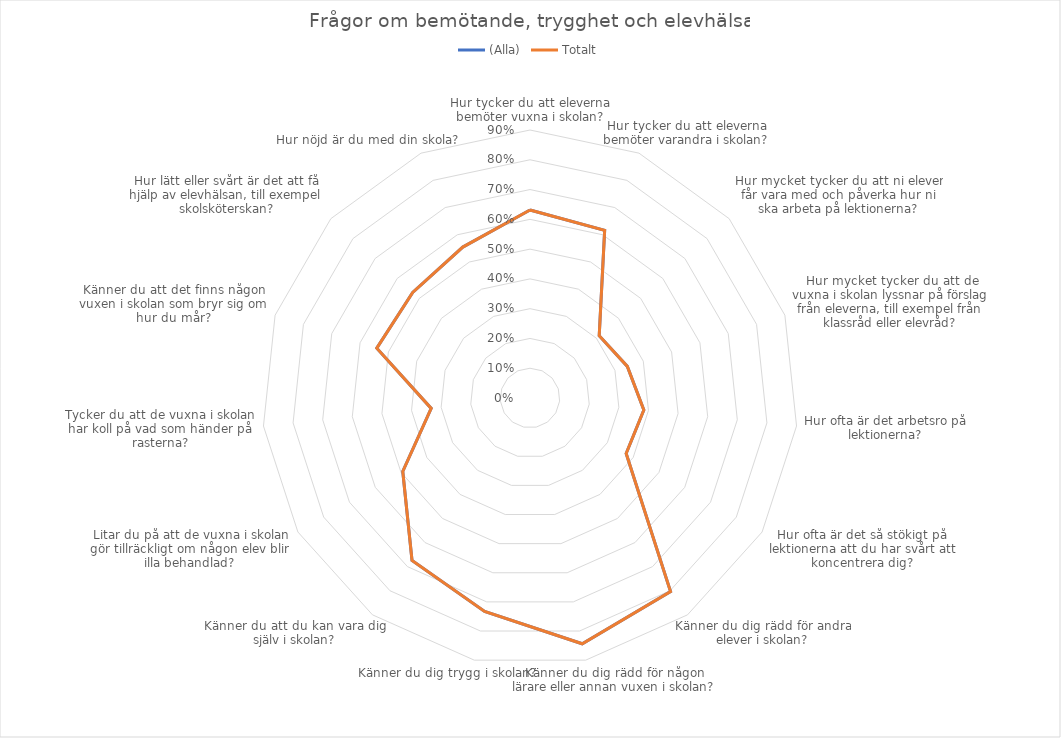
| Category | (Alla) | Totalt |
|---|---|---|
| Hur tycker du att eleverna bemöter vuxna i skolan? | 0.631 | 0.631 |
| Hur tycker du att eleverna bemöter varandra i skolan? | 0.616 | 0.616 |
| Hur mycket tycker du att ni elever får vara med och påverka hur ni ska arbeta på lektionerna? | 0.313 | 0.313 |
| Hur mycket tycker du att de vuxna i skolan lyssnar på förslag från eleverna, till exempel från klassråd eller elevråd? | 0.344 | 0.344 |
| Hur ofta är det arbetsro på lektionerna? | 0.384 | 0.384 |
| Hur ofta är det så stökigt på lektionerna att du har svårt att koncentrera dig? | 0.373 | 0.373 |
| Känner du dig rädd för andra elever i skolan? | 0.803 | 0.803 |
| Känner du dig rädd för någon lärare eller annan vuxen i skolan? | 0.844 | 0.844 |
| Känner du dig trygg i skolan? | 0.733 | 0.733 |
| Känner du att du kan vara dig själv i skolan? | 0.674 | 0.674 |
| Litar du på att de vuxna i skolan gör tillräckligt om någon elev blir illa behandlad? | 0.493 | 0.493 |
| Tycker du att de vuxna i skolan har koll på vad som händer på rasterna? | 0.334 | 0.334 |
| Känner du att det finns någon vuxen i skolan som bryr sig om hur du mår? | 0.541 | 0.541 |
| Hur lätt eller svårt är det att få hjälp av elevhälsan, till exempel skolsköterskan? | 0.53 | 0.53 |
| Hur nöjd är du med din skola? | 0.555 | 0.555 |